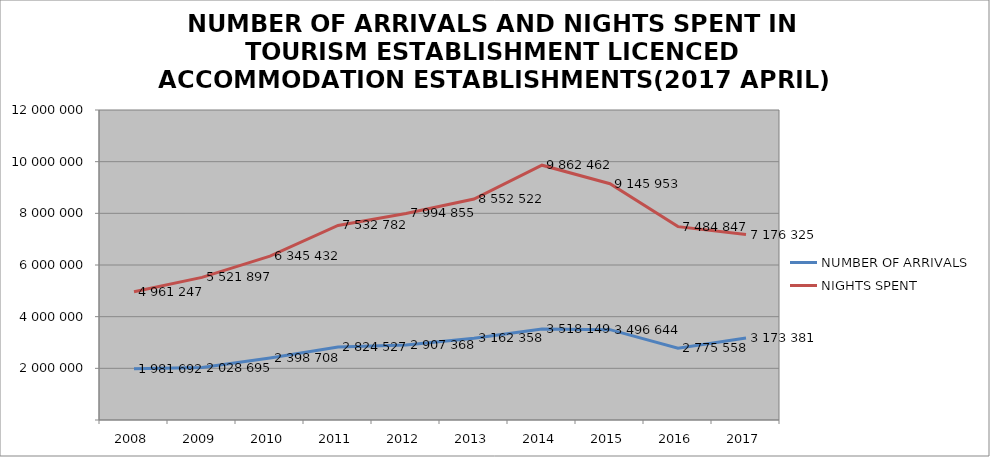
| Category | NUMBER OF ARRIVALS | NIGHTS SPENT |
|---|---|---|
| 2008 | 1981692 | 4961247 |
| 2009 | 2028695 | 5521897 |
| 2010 | 2398708 | 6345432 |
| 2011 | 2824527 | 7532782 |
| 2012 | 2907368 | 7994855 |
| 2013 | 3162358 | 8552522 |
| 2014 | 3518149 | 9862462 |
| 2015 | 3496644 | 9145953 |
| 2016 | 2775558 | 7484847 |
| 2017 | 3173381 | 7176325 |